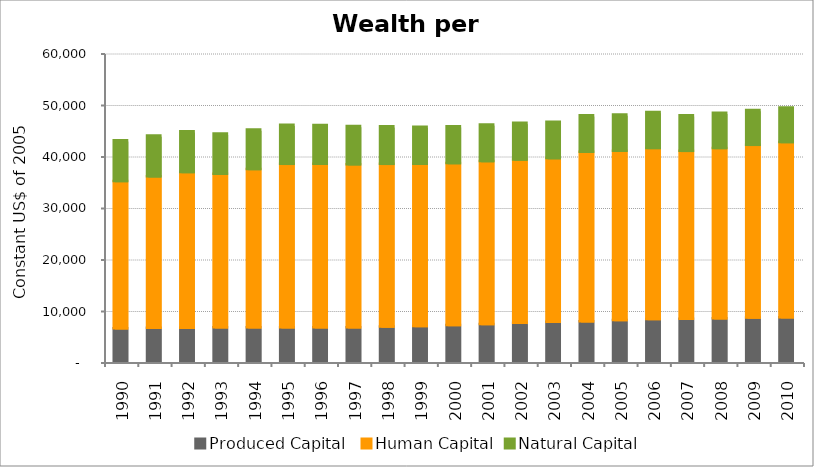
| Category | Produced Capital  | Human Capital | Natural Capital |
|---|---|---|---|
| 1990.0 | 6524.776 | 28576.771 | 7902.037 |
| 1991.0 | 6615.858 | 29399.157 | 7922.263 |
| 1992.0 | 6608.682 | 30239.264 | 7896.785 |
| 1993.0 | 6679.945 | 29844.676 | 7780.162 |
| 1994.0 | 6678.315 | 30754.001 | 7651.435 |
| 1995.0 | 6714.457 | 31724.328 | 7595.236 |
| 1996.0 | 6691.203 | 31763.853 | 7501.841 |
| 1997.0 | 6692.622 | 31671.56 | 7416.278 |
| 1998.0 | 6827.508 | 31605.791 | 7275.365 |
| 1999.0 | 6924.96 | 31525.851 | 7200.523 |
| 2000.0 | 7136.834 | 31441.073 | 7152.529 |
| 2001.0 | 7340.368 | 31629.736 | 7119.234 |
| 2002.0 | 7550.985 | 31733.841 | 7099.261 |
| 2003.0 | 7753.089 | 31787.678 | 7084.154 |
| 2004.0 | 7888.273 | 32902.629 | 7062.524 |
| 2005.0 | 8113.948 | 32874.816 | 7026.539 |
| 2006.0 | 8281.207 | 33247.173 | 6973.615 |
| 2007.0 | 8338.486 | 32610.948 | 6900.772 |
| 2008.0 | 8453.209 | 33070.257 | 6832.232 |
| 2009.0 | 8573.848 | 33549.831 | 6754.116 |
| 2010.0 | 8641.348 | 34029.415 | 6682.905 |